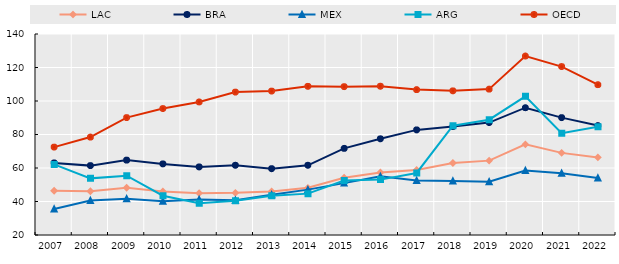
| Category | LAC | BRA | MEX | ARG | OECD |
|---|---|---|---|---|---|
| 2007.0 | 46.395 | 63.025 | 35.529 | 62.133 | 72.463 |
| 2008.0 | 46.127 | 61.42 | 40.605 | 53.814 | 78.468 |
| 2009.0 | 48.212 | 64.702 | 41.667 | 55.397 | 90.075 |
| 2010.0 | 45.982 | 62.433 | 40.155 | 43.454 | 95.473 |
| 2011.0 | 44.996 | 60.634 | 41.167 | 38.935 | 99.45 |
| 2012.0 | 45.182 | 61.614 | 40.815 | 40.436 | 105.301 |
| 2013.0 | 45.968 | 59.595 | 44.066 | 43.496 | 105.905 |
| 2014.0 | 48.157 | 61.617 | 47.093 | 44.697 | 108.742 |
| 2015.0 | 54.166 | 71.73 | 50.973 | 52.563 | 108.556 |
| 2016.0 | 57.292 | 77.422 | 55.003 | 53.06 | 108.801 |
| 2017.0 | 58.84 | 82.745 | 52.521 | 57.028 | 106.796 |
| 2018.0 | 62.971 | 84.777 | 52.202 | 85.246 | 106.062 |
| 2019.0 | 64.4 | 87.118 | 51.858 | 88.835 | 107.094 |
| 2020.0 | 74.104 | 96.007 | 58.51 | 102.79 | 126.857 |
| 2021.0 | 69.029 | 90.068 | 56.917 | 80.82 | 120.553 |
| 2022.0 | 66.314 | 85.33 | 54.073 | 84.685 | 109.755 |